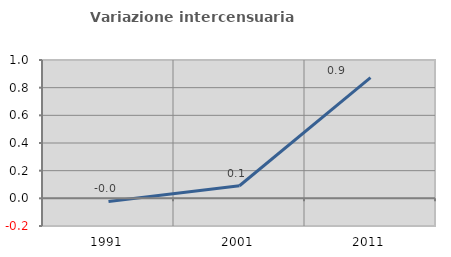
| Category | Variazione intercensuaria annua |
|---|---|
| 1991.0 | -0.023 |
| 2001.0 | 0.091 |
| 2011.0 | 0.872 |